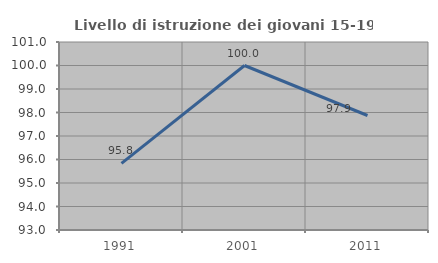
| Category | Livello di istruzione dei giovani 15-19 anni |
|---|---|
| 1991.0 | 95.833 |
| 2001.0 | 100 |
| 2011.0 | 97.872 |